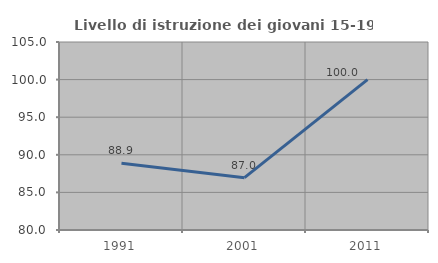
| Category | Livello di istruzione dei giovani 15-19 anni |
|---|---|
| 1991.0 | 88.889 |
| 2001.0 | 86.957 |
| 2011.0 | 100 |